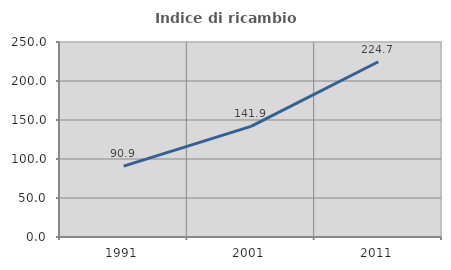
| Category | Indice di ricambio occupazionale  |
|---|---|
| 1991.0 | 90.909 |
| 2001.0 | 141.899 |
| 2011.0 | 224.691 |